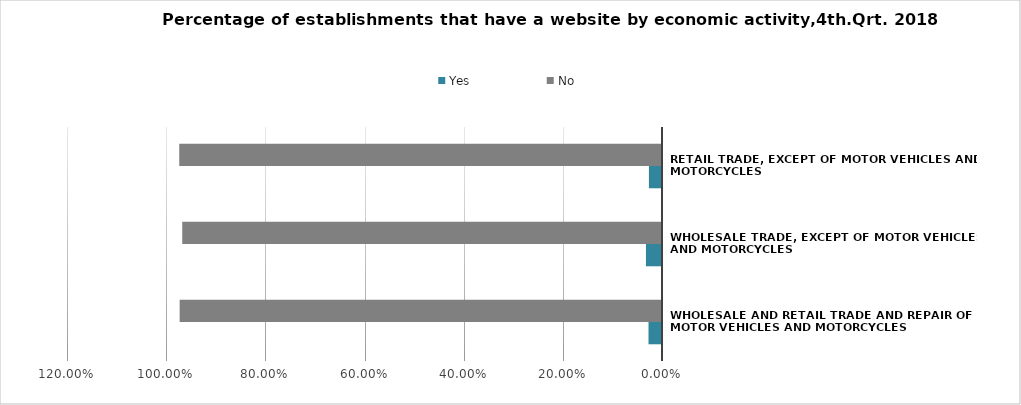
| Category | Yes | No |
|---|---|---|
| Wholesale and retail trade and repair of motor vehicles and motorcycles | 0.027 | 0.973 |
| Wholesale trade, except of motor vehicles and motorcycles | 0.032 | 0.968 |
| Retail trade, except of motor vehicles and motorcycles | 0.026 | 0.974 |